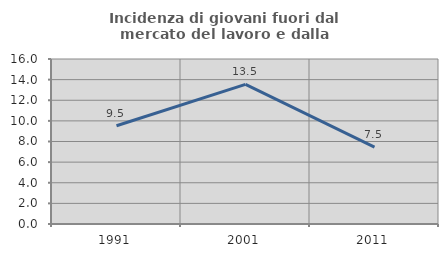
| Category | Incidenza di giovani fuori dal mercato del lavoro e dalla formazione  |
|---|---|
| 1991.0 | 9.524 |
| 2001.0 | 13.542 |
| 2011.0 | 7.463 |